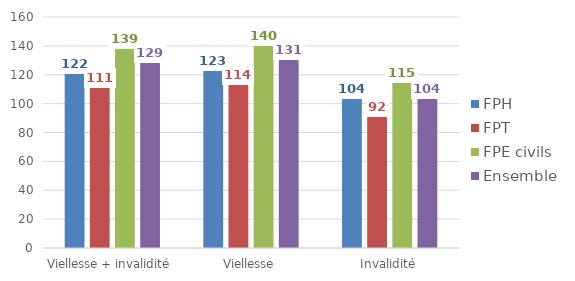
| Category | FPH | FPT | FPE civils | Ensemble |
|---|---|---|---|---|
| Viellesse + invalidité | 121.51 | 111.2 | 138.871 | 128.659 |
| Viellesse | 123.262 | 113.787 | 140.413 | 130.791 |
| Invalidité | 103.736 | 91.7 | 115.042 | 104.241 |